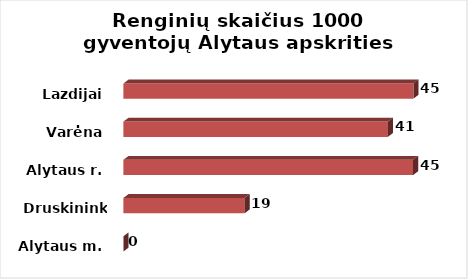
| Category | Series 0 |
|---|---|
| Alytaus m. | 0 |
| Druskininkai | 18.905 |
| Alytaus r. | 45.196 |
| Varėna | 41.267 |
| Lazdijai | 45.253 |